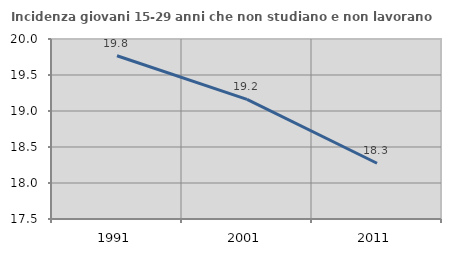
| Category | Incidenza giovani 15-29 anni che non studiano e non lavorano  |
|---|---|
| 1991.0 | 19.767 |
| 2001.0 | 19.162 |
| 2011.0 | 18.274 |